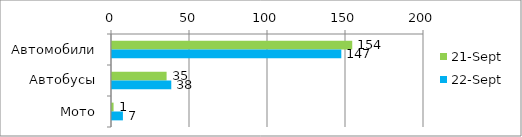
| Category | 21.сен | 22.сен |
|---|---|---|
| Автомобили | 154 | 147 |
| Автобусы | 35 | 38 |
| Мото | 1 | 7 |